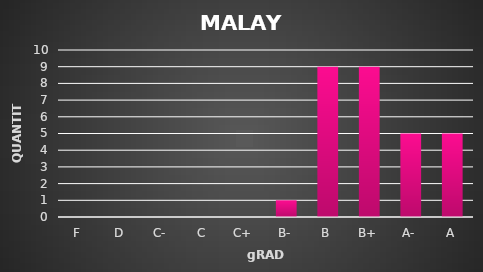
| Category | QUANTITY |
|---|---|
| F | 0 |
| D | 0 |
| C- | 0 |
| C | 0 |
| C+ | 0 |
| B- | 1 |
| B | 9 |
| B+ | 9 |
| A- | 5 |
| A | 5 |